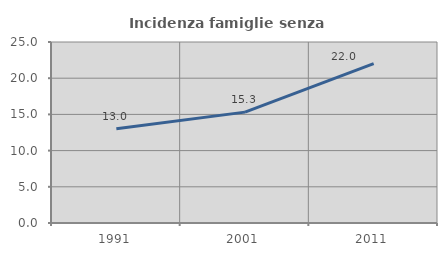
| Category | Incidenza famiglie senza nuclei |
|---|---|
| 1991.0 | 13.014 |
| 2001.0 | 15.313 |
| 2011.0 | 22.004 |